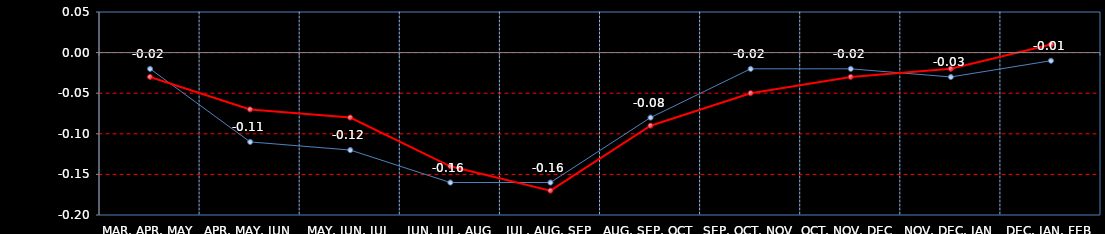
| Category | Last | Settlement | First MA | Second MA | Third MA |
|---|---|---|---|---|---|
| MAR, APR, MAY | -0.02 | -0.03 |  |  |  |
| APR, MAY, JUN | -0.11 | -0.07 |  |  |  |
| MAY, JUN, JUL | -0.12 | -0.08 |  |  |  |
| JUN, JUL, AUG | -0.16 | -0.14 |  |  |  |
| JUL, AUG, SEP | -0.16 | -0.17 |  |  |  |
| AUG, SEP, OCT | -0.08 | -0.09 |  |  |  |
| SEP, OCT, NOV | -0.02 | -0.05 |  |  |  |
| OCT, NOV, DEC | -0.02 | -0.03 |  |  |  |
| NOV, DEC, JAN | -0.03 | -0.02 |  |  |  |
| DEC, JAN, FEB | -0.01 | 0.01 |  |  |  |